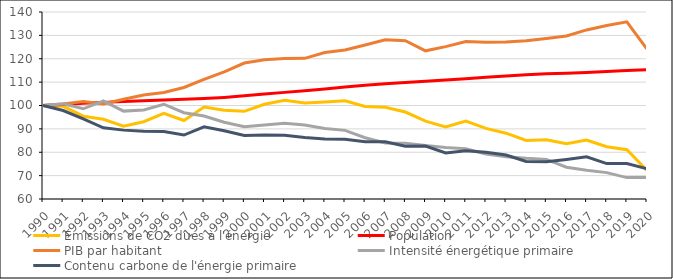
| Category | Émissions de CO2 dues à l'énergie | Population | PIB par habitant | Intensité énergétique primaire | Contenu carbone de l'énergie primaire |
|---|---|---|---|---|---|
| 1990.0 | 100 | 100 | 100 | 100 | 100 |
| 1991.0 | 99.643 | 100.47 | 100.604 | 100.74 | 97.856 |
| 1992.0 | 95.42 | 100.936 | 101.744 | 98.588 | 94.245 |
| 1993.0 | 94.085 | 101.337 | 100.655 | 101.972 | 90.456 |
| 1994.0 | 91.167 | 101.675 | 102.689 | 97.598 | 89.466 |
| 1995.0 | 93.056 | 102.002 | 104.475 | 98.103 | 89.01 |
| 1996.0 | 96.604 | 102.323 | 105.596 | 100.551 | 88.918 |
| 1997.0 | 93.592 | 102.643 | 107.696 | 96.903 | 87.372 |
| 1998.0 | 99.363 | 102.978 | 111.181 | 95.5 | 90.876 |
| 1999.0 | 97.979 | 103.471 | 114.396 | 92.822 | 89.176 |
| 2000.0 | 97.496 | 104.15 | 118.153 | 90.926 | 87.136 |
| 2001.0 | 100.536 | 104.88 | 119.592 | 91.706 | 87.403 |
| 2002.0 | 102.27 | 105.616 | 120.067 | 92.401 | 87.28 |
| 2003.0 | 101.077 | 106.339 | 120.165 | 91.636 | 86.321 |
| 2004.0 | 101.489 | 107.099 | 122.659 | 90.199 | 85.652 |
| 2005.0 | 102.014 | 107.887 | 123.725 | 89.361 | 85.524 |
| 2006.0 | 99.603 | 108.621 | 125.851 | 86.217 | 84.511 |
| 2007.0 | 99.246 | 109.269 | 128.122 | 83.93 | 84.466 |
| 2008.0 | 97.21 | 109.86 | 127.73 | 83.87 | 82.599 |
| 2009.0 | 93.333 | 110.416 | 123.4 | 82.862 | 82.667 |
| 2010.0 | 90.862 | 110.949 | 125.189 | 82.051 | 79.728 |
| 2011.0 | 93.308 | 111.487 | 127.328 | 81.461 | 80.69 |
| 2012.0 | 90.209 | 112.041 | 127.015 | 79.272 | 79.966 |
| 2013.0 | 88.163 | 112.615 | 127.133 | 78.118 | 78.828 |
| 2014.0 | 85.014 | 113.147 | 127.713 | 77.386 | 76.023 |
| 2015.0 | 85.348 | 113.536 | 128.675 | 76.921 | 75.949 |
| 2016.0 | 83.599 | 113.834 | 129.744 | 73.585 | 76.922 |
| 2017.0 | 85.257 | 114.165 | 132.332 | 72.275 | 78.081 |
| 2018.0 | 82.374 | 114.568 | 134.23 | 71.289 | 75.137 |
| 2019.0 | 81.114 | 114.957 | 135.795 | 69.152 | 75.14 |
| 2020.0 | 72.195 | 115.266 | 124.135 | 69.178 | 72.937 |